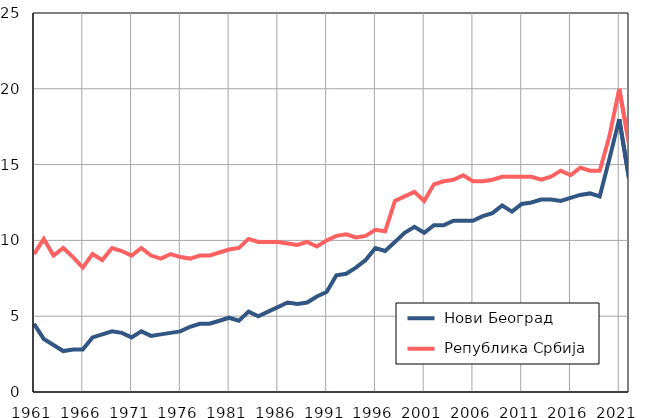
| Category |  Нови Београд |  Република Србија |
|---|---|---|
| 1961.0 | 4.5 | 9.1 |
| 1962.0 | 3.5 | 10.1 |
| 1963.0 | 3.1 | 9 |
| 1964.0 | 2.7 | 9.5 |
| 1965.0 | 2.8 | 8.9 |
| 1966.0 | 2.8 | 8.2 |
| 1967.0 | 3.6 | 9.1 |
| 1968.0 | 3.8 | 8.7 |
| 1969.0 | 4 | 9.5 |
| 1970.0 | 3.9 | 9.3 |
| 1971.0 | 3.6 | 9 |
| 1972.0 | 4 | 9.5 |
| 1973.0 | 3.7 | 9 |
| 1974.0 | 3.8 | 8.8 |
| 1975.0 | 3.9 | 9.1 |
| 1976.0 | 4 | 8.9 |
| 1977.0 | 4.3 | 8.8 |
| 1978.0 | 4.5 | 9 |
| 1979.0 | 4.5 | 9 |
| 1980.0 | 4.7 | 9.2 |
| 1981.0 | 4.9 | 9.4 |
| 1982.0 | 4.7 | 9.5 |
| 1983.0 | 5.3 | 10.1 |
| 1984.0 | 5 | 9.9 |
| 1985.0 | 5.3 | 9.9 |
| 1986.0 | 5.6 | 9.9 |
| 1987.0 | 5.9 | 9.8 |
| 1988.0 | 5.8 | 9.7 |
| 1989.0 | 5.9 | 9.9 |
| 1990.0 | 6.3 | 9.6 |
| 1991.0 | 6.6 | 10 |
| 1992.0 | 7.7 | 10.3 |
| 1993.0 | 7.8 | 10.4 |
| 1994.0 | 8.2 | 10.2 |
| 1995.0 | 8.7 | 10.3 |
| 1996.0 | 9.5 | 10.7 |
| 1997.0 | 9.3 | 10.6 |
| 1998.0 | 9.9 | 12.6 |
| 1999.0 | 10.5 | 12.9 |
| 2000.0 | 10.9 | 13.2 |
| 2001.0 | 10.5 | 12.6 |
| 2002.0 | 11 | 13.7 |
| 2003.0 | 11 | 13.9 |
| 2004.0 | 11.3 | 14 |
| 2005.0 | 11.3 | 14.3 |
| 2006.0 | 11.3 | 13.9 |
| 2007.0 | 11.6 | 13.9 |
| 2008.0 | 11.8 | 14 |
| 2009.0 | 12.3 | 14.2 |
| 2010.0 | 11.9 | 14.2 |
| 2011.0 | 12.4 | 14.2 |
| 2012.0 | 12.5 | 14.2 |
| 2013.0 | 12.7 | 14 |
| 2014.0 | 12.7 | 14.2 |
| 2015.0 | 12.6 | 14.6 |
| 2016.0 | 12.8 | 14.3 |
| 2017.0 | 13 | 14.8 |
| 2018.0 | 13.1 | 14.6 |
| 2019.0 | 12.9 | 14.6 |
| 2020.0 | 15.4 | 16.9 |
| 2021.0 | 18 | 20 |
| 2022.0 | 14.1 | 16.4 |